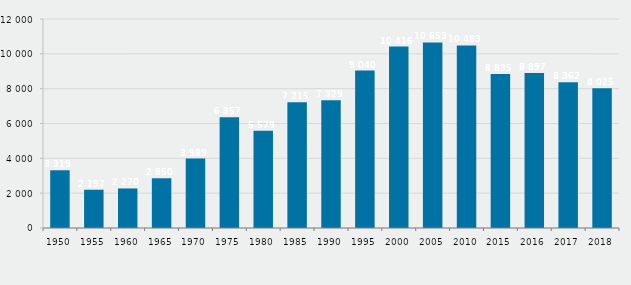
| Category | im jeweililgen Berichtsjahr |
|---|---|
| 1950.0 | 3319 |
| 1955.0 | 2197 |
| 1960.0 | 2270 |
| 1965.0 | 2850 |
| 1970.0 | 3989 |
| 1975.0 | 6357 |
| 1980.0 | 5579 |
| 1985.0 | 7215 |
| 1990.0 | 7329 |
| 1995.0 | 9040 |
| 2000.0 | 10416 |
| 2005.0 | 10653 |
| 2010.0 | 10483 |
| 2015.0 | 8835 |
| 2016.0 | 8897 |
| 2017.0 | 8362 |
| 2018.0 | 8025 |